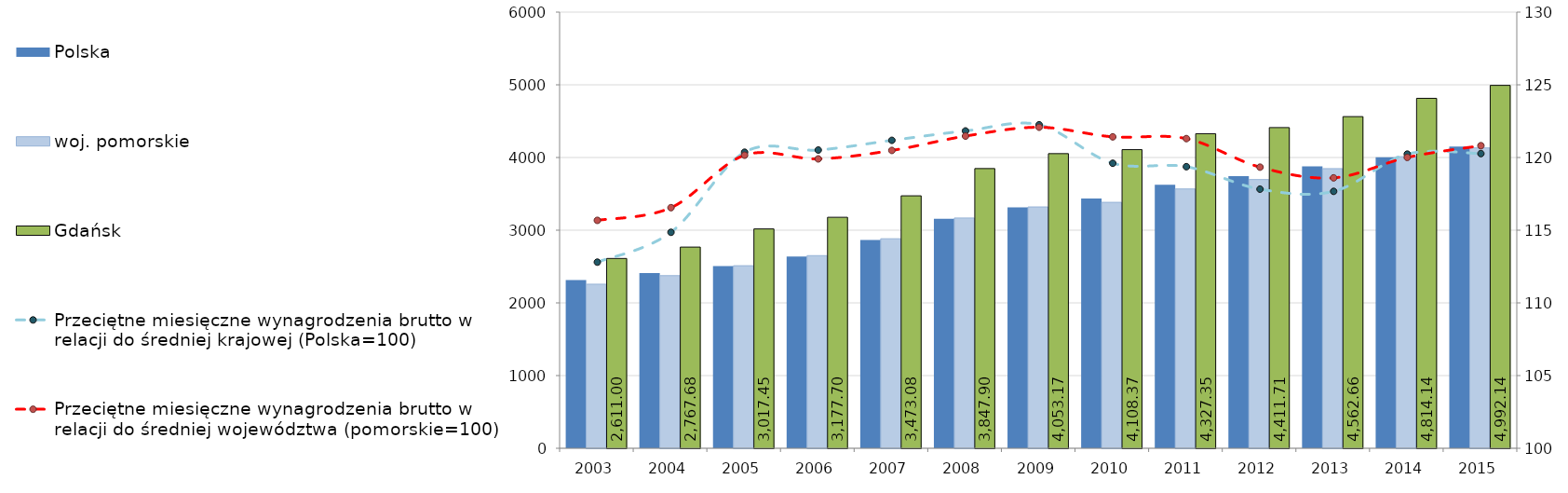
| Category | Polska | woj. pomorskie | Gdańsk |
|---|---|---|---|
| 2003.0 | 2314.66 | 2257.16 | 2611 |
| 2004.0 | 2409.69 | 2374.71 | 2767.68 |
| 2005.0 | 2506.93 | 2511.25 | 3017.45 |
| 2006.0 | 2636.81 | 2650.2 | 3177.7 |
| 2007.0 | 2866.04 | 2882.56 | 3473.08 |
| 2008.0 | 3158.48 | 3167.7 | 3847.9 |
| 2009.0 | 3315.38 | 3320.06 | 4053.17 |
| 2010.0 | 3435 | 3383.58 | 4108.37 |
| 2011.0 | 3625.21 | 3567.49 | 4327.35 |
| 2012.0 | 3744.38 | 3696.89 | 4411.71 |
| 2013.0 | 3877.43 | 3847.12 | 4562.66 |
| 2014.0 | 4003.99 | 4011.59 | 4814.14 |
| 2015.0 | 4150.88 | 4132.13 | 4992.14 |